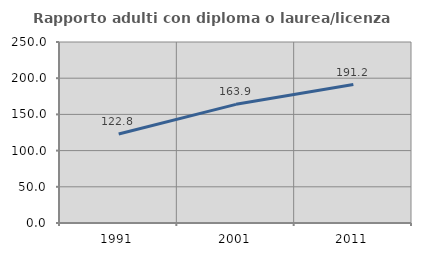
| Category | Rapporto adulti con diploma o laurea/licenza media  |
|---|---|
| 1991.0 | 122.837 |
| 2001.0 | 163.908 |
| 2011.0 | 191.197 |